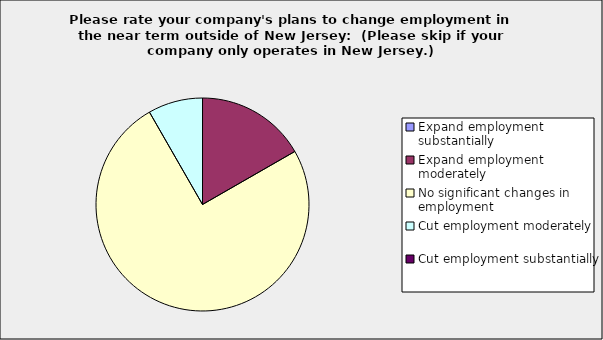
| Category | Series 0 |
|---|---|
| Expand employment substantially | 0 |
| Expand employment moderately | 0.167 |
| No significant changes in employment | 0.75 |
| Cut employment moderately | 0.083 |
| Cut employment substantially | 0 |